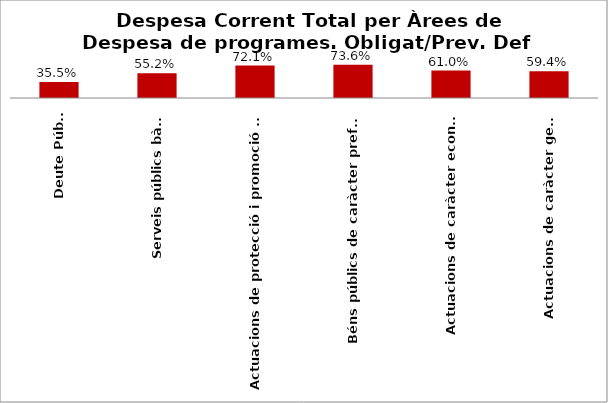
| Category | Series 0 |
|---|---|
| Deute Públic | 0.355 |
| Serveis públics bàsics | 0.552 |
| Actuacions de protecció i promoció social | 0.721 |
| Béns públics de caràcter preferent | 0.736 |
| Actuacions de caràcter econòmic | 0.61 |
| Actuacions de caràcter general | 0.594 |